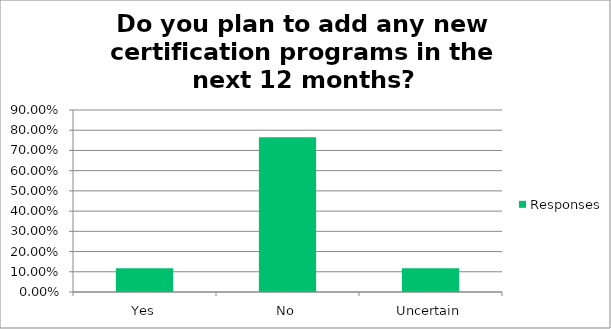
| Category | Responses |
|---|---|
| Yes | 0.118 |
| No | 0.765 |
| Uncertain | 0.118 |